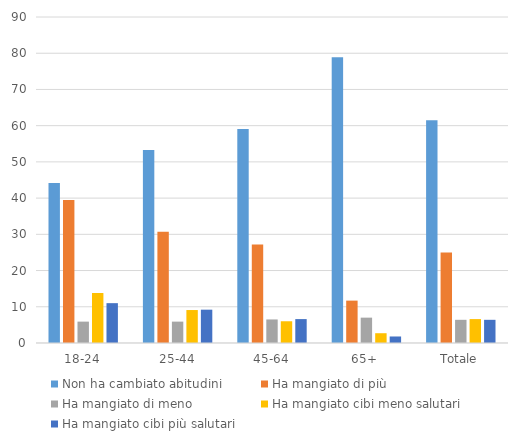
| Category | Non ha cambiato abitudini | Ha mangiato di più | Ha mangiato di meno | Ha mangiato cibi meno salutari | Ha mangiato cibi più salutari |
|---|---|---|---|---|---|
| 18-24 | 44.2 | 39.5 | 5.9 | 13.8 | 11 |
| 25-44 | 53.3 | 30.7 | 5.9 | 9.1 | 9.2 |
| 45-64 | 59.1 | 27.2 | 6.5 | 6 | 6.6 |
| 65+ | 78.9 | 11.7 | 7 | 2.7 | 1.8 |
| Totale | 61.5 | 25 | 6.4 | 6.6 | 6.4 |